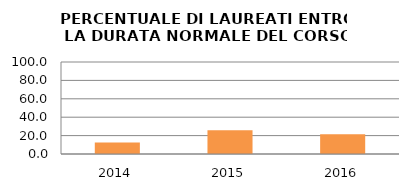
| Category | 2014 2015 2016 |
|---|---|
| 2014.0 | 12.5 |
| 2015.0 | 25.806 |
| 2016.0 | 21.429 |